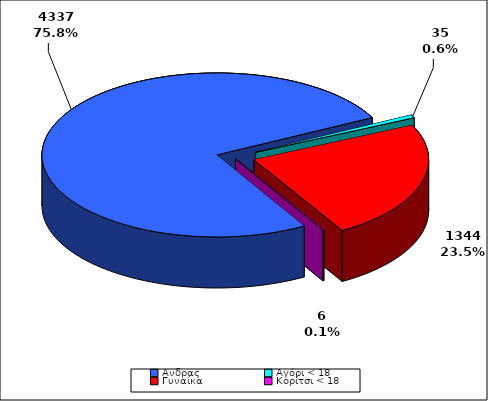
| Category | ΣΥΝΟΛΟ |
|---|---|
| Aνδρας | 4337 |
| Αγόρι < 18 | 35 |
| Γυναίκα | 1344 |
| Κορίτσι < 18 | 6 |